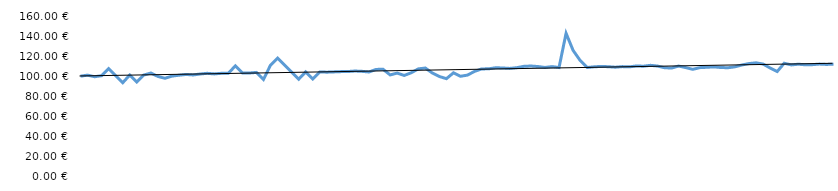
| Category | Linie |
|---|---|
| 0 | 100.19 |
| 1 | 101.24 |
| 2 | 99.65 |
| 3 | 100.68 |
| 4 | 107.68 |
| 5 | 100.68 |
| 6 | 93.68 |
| 7 | 101.38 |
| 8 | 94.38 |
| 9 | 101.35 |
| 10 | 103.32 |
| 11 | 99.92 |
| 12 | 98.1 |
| 13 | 100.27 |
| 14 | 101.15 |
| 15 | 101.92 |
| 16 | 101.41 |
| 17 | 102.35 |
| 18 | 103.05 |
| 19 | 102.45 |
| 20 | 103.05 |
| 21 | 103.02 |
| 22 | 110.44 |
| 23 | 103.42 |
| 24 | 103.34 |
| 25 | 103.95 |
| 26 | 96.95 |
| 27 | 111.15 |
| 28 | 118.15 |
| 29 | 111.15 |
| 30 | 104.15 |
| 31 | 97.15 |
| 32 | 104.45 |
| 33 | 97.45 |
| 34 | 104.45 |
| 35 | 104.17 |
| 36 | 104.45 |
| 37 | 104.73 |
| 38 | 104.81 |
| 39 | 105.31 |
| 40 | 105 |
| 41 | 104.35 |
| 42 | 106.94 |
| 43 | 107 |
| 44 | 101.45 |
| 45 | 103.25 |
| 46 | 100.94 |
| 47 | 103.6 |
| 48 | 107.45 |
| 49 | 108.29 |
| 50 | 103.32 |
| 51 | 99.84 |
| 52 | 97.72 |
| 53 | 103.55 |
| 54 | 100.09 |
| 55 | 101.28 |
| 56 | 104.99 |
| 57 | 107.39 |
| 58 | 107.52 |
| 59 | 108.58 |
| 60 | 108.34 |
| 61 | 107.92 |
| 62 | 108.64 |
| 63 | 109.97 |
| 64 | 110.29 |
| 65 | 109.78 |
| 66 | 108.87 |
| 67 | 109.71 |
| 68 | 108.81 |
| 69 | 142.81 |
| 70 | 125.81 |
| 71 | 115.81 |
| 72 | 108.81 |
| 73 | 109.51 |
| 74 | 109.91 |
| 75 | 109.61 |
| 76 | 109.11 |
| 77 | 109.71 |
| 78 | 109.45 |
| 79 | 110.35 |
| 80 | 110.1 |
| 81 | 110.98 |
| 82 | 110.25 |
| 83 | 108.57 |
| 84 | 108.29 |
| 85 | 110.25 |
| 86 | 108.74 |
| 87 | 106.99 |
| 88 | 108.67 |
| 89 | 109.02 |
| 90 | 109.44 |
| 91 | 108.8 |
| 92 | 108.59 |
| 93 | 109.5 |
| 94 | 111.35 |
| 95 | 112.75 |
| 96 | 113.45 |
| 97 | 112.23 |
| 98 | 108.31 |
| 99 | 104.81 |
| 100 | 113.07 |
| 101 | 111.39 |
| 102 | 112.09 |
| 103 | 111.52 |
| 104 | 111.66 |
| 105 | 112.22 |
| 106 | 111.86 |
| 107 | 112.15 |